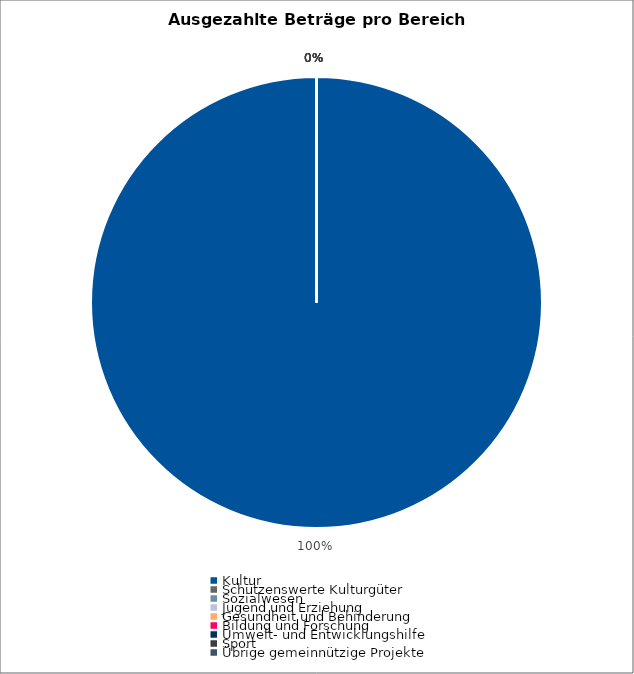
| Category | Series 0 |
|---|---|
| Kultur | 22364951.86 |
| Schützenswerte Kulturgüter | 0 |
| Sozialwesen | 0 |
| Jugend und Erziehung | 0 |
| Gesundheit und Behinderung | 0 |
| Bildung und Forschung | 0 |
| Umwelt- und Entwicklungshilfe | 0 |
| Sport | 0 |
| Übrige gemeinnützige Projekte | 0 |